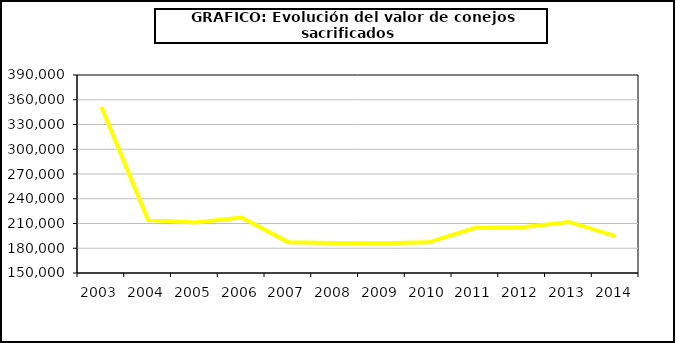
| Category | Peso canal |
|---|---|
| 2003.0 | 351465.713 |
| 2004.0 | 214260.585 |
| 2005.0 | 211365.141 |
| 2006.0 | 217184.462 |
| 2007.0 | 187399.808 |
| 2008.0 | 186307.329 |
| 2009.0 | 186191.465 |
| 2010.0 | 187154.598 |
| 2011.0 | 204859.313 |
| 2012.0 | 205502.84 |
| 2013.0 | 211908.742 |
| 2014.0 | 194679.563 |